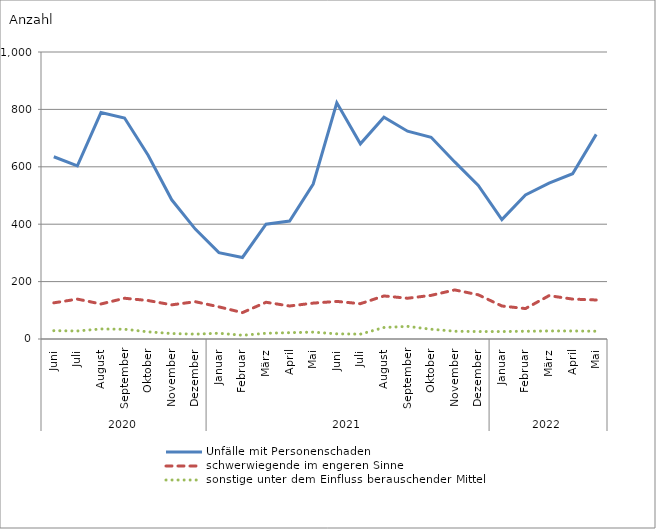
| Category | Unfälle mit Personenschaden | schwerwiegende im engeren Sinne | sonstige unter dem Einfluss berauschender Mittel |
|---|---|---|---|
| 0 | 635 | 126 | 29 |
| 1 | 603 | 139 | 28 |
| 2 | 789 | 122 | 35 |
| 3 | 770 | 142 | 34 |
| 4 | 640 | 134 | 25 |
| 5 | 485 | 119 | 19 |
| 6 | 383 | 130 | 17 |
| 7 | 301 | 112 | 20 |
| 8 | 284 | 92 | 13 |
| 9 | 400 | 128 | 20 |
| 10 | 411 | 115 | 22 |
| 11 | 540 | 125 | 24 |
| 12 | 823 | 131 | 18 |
| 13 | 680 | 123 | 17 |
| 14 | 773 | 150 | 40 |
| 15 | 724 | 142 | 44 |
| 16 | 703 | 152 | 34 |
| 17 | 617 | 171 | 27 |
| 18 | 535 | 154 | 26 |
| 19 | 416 | 115 | 26 |
| 20 | 502 | 106 | 27 |
| 21 | 543 | 151 | 28 |
| 22 | 576 | 139 | 28 |
| 23 | 713 | 136 | 27 |